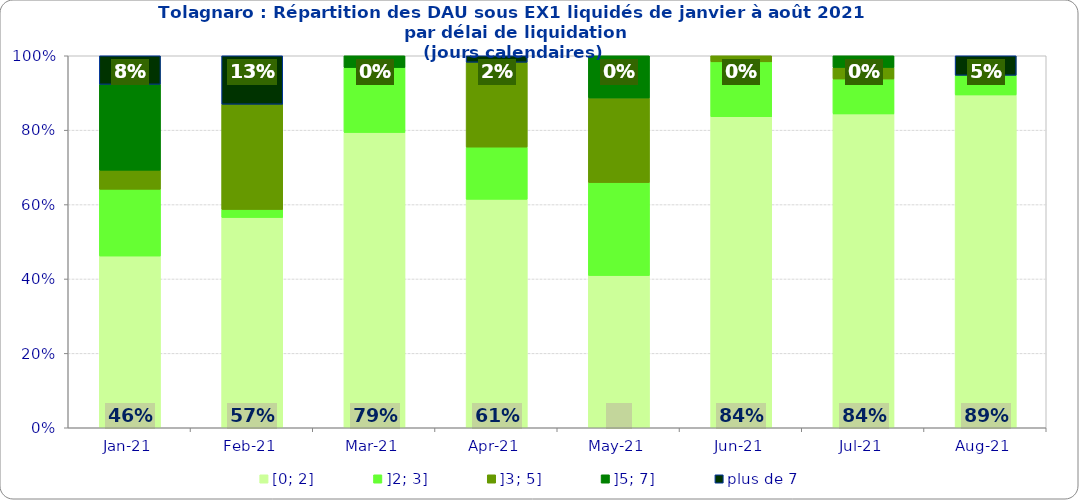
| Category | [0; 2] | ]2; 3] | ]3; 5] | ]5; 7] | plus de 7 |
|---|---|---|---|---|---|
| 2021-01-01 | 0.462 | 0.179 | 0.051 | 0.231 | 0.077 |
| 2021-02-01 | 0.565 | 0.022 | 0.283 | 0 | 0.13 |
| 2021-03-01 | 0.794 | 0.175 | 0 | 0.032 | 0 |
| 2021-04-01 | 0.614 | 0.14 | 0.228 | 0 | 0.018 |
| 2021-05-01 | 0.409 | 0.25 | 0.227 | 0.114 | 0 |
| 2021-06-01 | 0.836 | 0.148 | 0.016 | 0 | 0 |
| 2021-07-01 | 0.844 | 0.094 | 0.031 | 0.031 | 0 |
| 2021-08-01 | 0.895 | 0.053 | 0 | 0 | 0.053 |